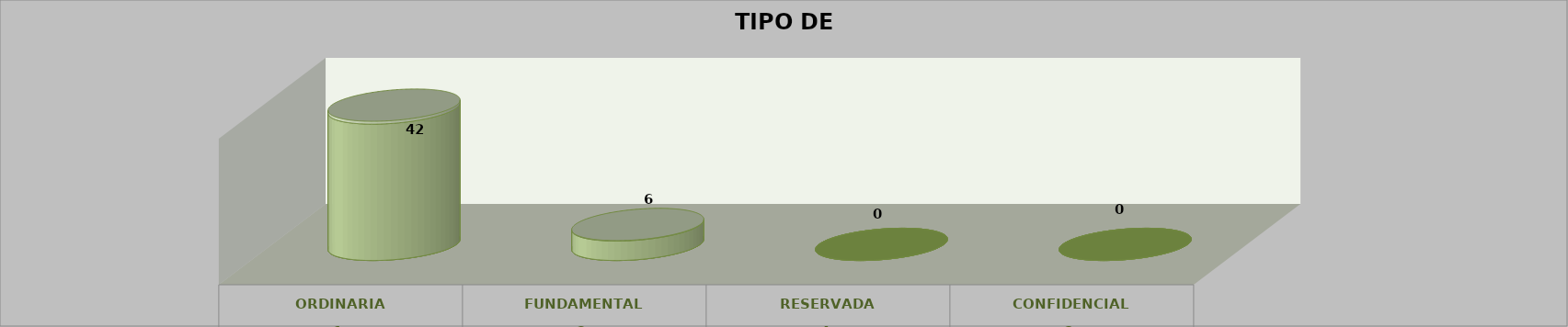
| Category | Series 0 | Series 2 | Series 1 | Series 3 | Series 4 |
|---|---|---|---|---|---|
| 0 |  |  |  | 42 | 0.875 |
| 1 |  |  |  | 6 | 0.125 |
| 2 |  |  |  | 0 | 0 |
| 3 |  |  |  | 0 | 0 |